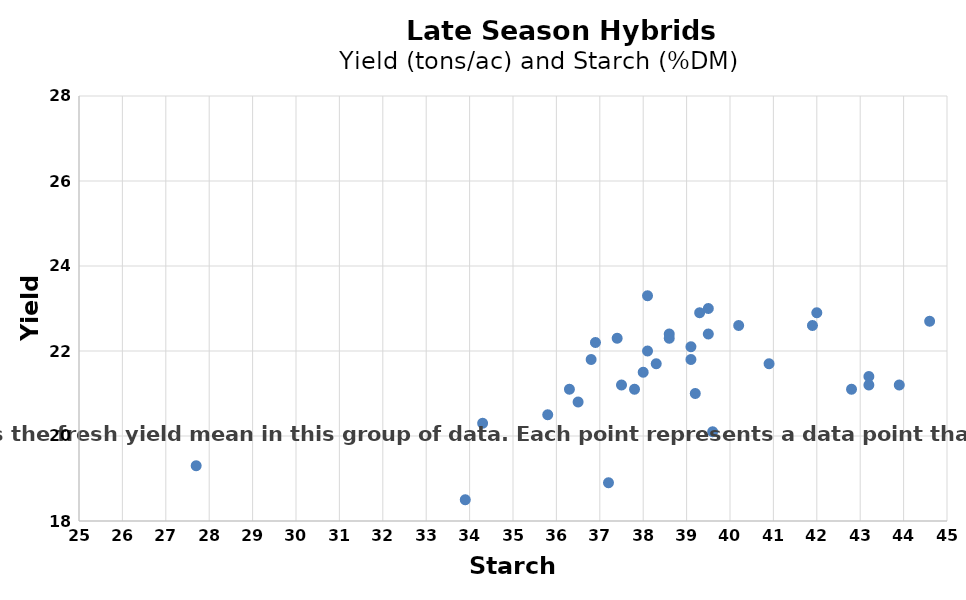
| Category | Series 0 |
|---|---|
| 44.6 | 22.7 |
| 43.2 | 21.2 |
| 41.9 | 22.6 |
| 40.2 | 22.6 |
| 43.2 | 21.4 |
| 42.0 | 22.9 |
| 42.8 | 21.1 |
| 39.5 | 22.4 |
| 40.9 | 21.7 |
| 43.9 | 21.2 |
| 39.2 | 21 |
| 38.6 | 22.4 |
| 37.8 | 21.1 |
| 39.5 | 23 |
| 37.2 | 18.9 |
| 38.1 | 22 |
| 38.3 | 21.7 |
| 38.0 | 21.5 |
| 39.1 | 22.1 |
| 38.6 | 22.3 |
| 39.6 | 20.1 |
| 38.1 | 23.3 |
| 37.5 | 21.2 |
| 39.3 | 22.9 |
| 37.4 | 22.3 |
| 36.8 | 21.8 |
| 36.9 | 22.2 |
| 34.3 | 20.3 |
| 36.3 | 21.1 |
| 39.1 | 21.8 |
| 35.8 | 20.5 |
| 33.9 | 18.5 |
| 27.7 | 19.3 |
| 36.5 | 20.8 |